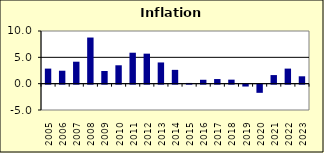
| Category | 0.1 |
|---|---|
| 2005.0 | 2.86 |
| 2006.0 | 2.458 |
| 2007.0 | 4.169 |
| 2008.0 | 8.759 |
| 2009.0 | 2.409 |
| 2010.0 | 3.491 |
| 2011.0 | 5.876 |
| 2012.0 | 5.698 |
| 2013.0 | 4.027 |
| 2014.0 | 2.623 |
| 2015.0 | 0.137 |
| 2016.0 | 0.74 |
| 2017.0 | 0.876 |
| 2018.0 | 0.762 |
| 2019.0 | -0.355 |
| 2020.0 | -1.55 |
| 2021.0 | 1.631 |
| 2022.0 | 2.86 |
| 2023.0 | 1.4 |